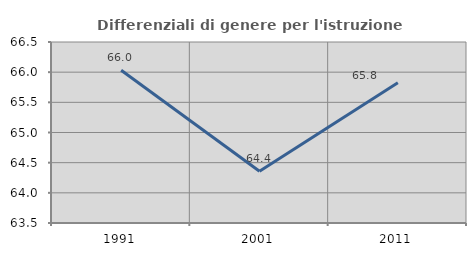
| Category | Differenziali di genere per l'istruzione superiore |
|---|---|
| 1991.0 | 66.031 |
| 2001.0 | 64.356 |
| 2011.0 | 65.823 |